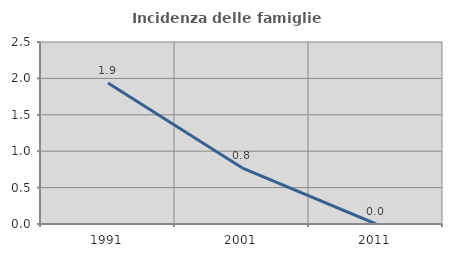
| Category | Incidenza delle famiglie numerose |
|---|---|
| 1991.0 | 1.938 |
| 2001.0 | 0.772 |
| 2011.0 | 0 |